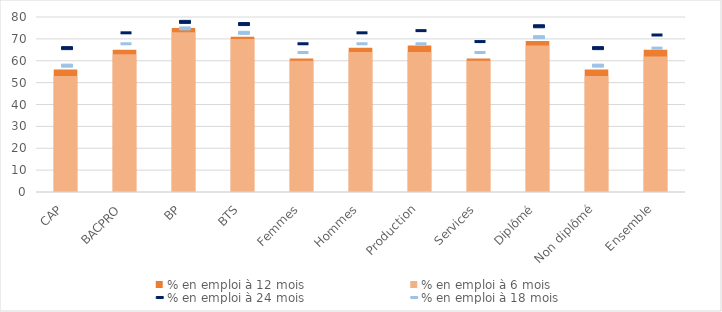
| Category | % en emploi à 12 mois | % en emploi à 6 mois |
|---|---|---|
| CAP | 56 | 53 |
| BACPRO | 65 | 63 |
| BP | 75 | 73 |
| BTS | 71 | 70 |
| Femmes | 61 | 60 |
| Hommes | 66 | 64 |
| Production | 67 | 64 |
| Services | 61 | 60 |
| Diplômé | 69 | 67 |
| Non diplômé | 56 | 53 |
| Ensemble | 65 | 62 |